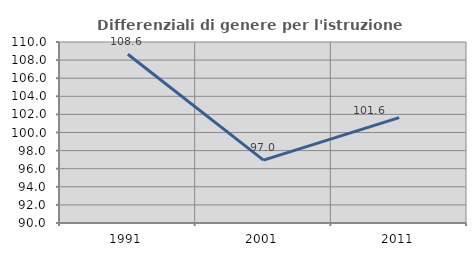
| Category | Differenziali di genere per l'istruzione superiore |
|---|---|
| 1991.0 | 108.643 |
| 2001.0 | 96.952 |
| 2011.0 | 101.637 |